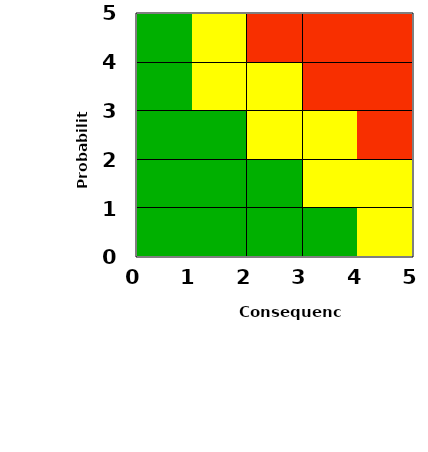
| Category | Series 0 |
|---|---|
| 2.625 | 0 |